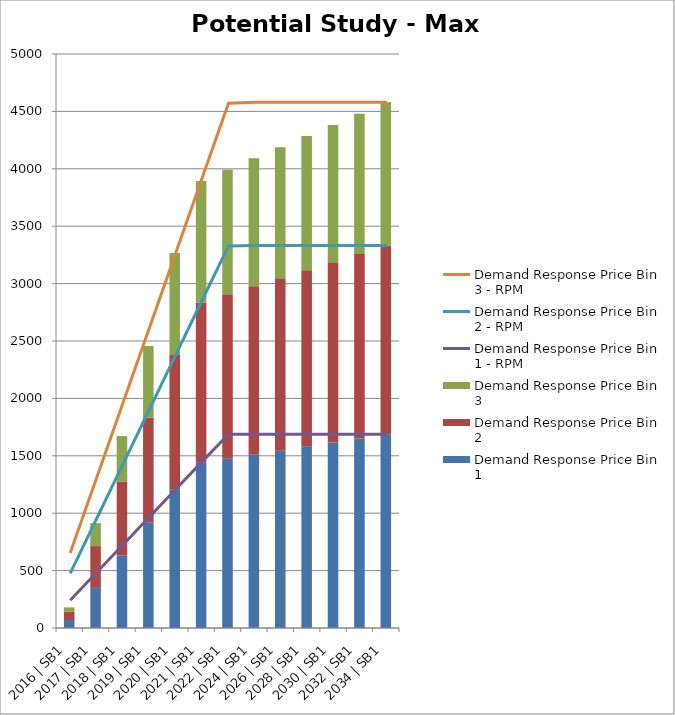
| Category | Demand Response Price Bin 1 | Demand Response Price Bin 2 | Demand Response Price Bin 3 |
|---|---|---|---|
| 2016 | SB1 | 69.487 | 74.118 | 35.921 |
| 2017 | SB1 | 349.088 | 364.472 | 199.277 |
| 2018 | SB1 | 632.108 | 644.656 | 394.976 |
| 2019 | SB1 | 918.175 | 913.727 | 624.163 |
| 2020 | SB1 | 1207.937 | 1171.137 | 888.002 |
| 2021 | SB1 | 1439.241 | 1396.167 | 1058.977 |
| 2022 | SB1 | 1474.649 | 1432.346 | 1087.244 |
| 2024 | SB1 | 1509.597 | 1468.015 | 1115.097 |
| 2026 | SB1 | 1543.549 | 1502.812 | 1142.33 |
| 2028 | SB1 | 1579.599 | 1537.547 | 1168.57 |
| 2030 | SB1 | 1615.132 | 1571.833 | 1194.493 |
| 2032 | SB1 | 1651.463 | 1606.884 | 1220.991 |
| 2034 | SB1 | 1688.613 | 1642.717 | 1248.078 |